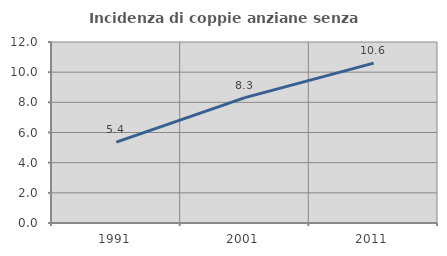
| Category | Incidenza di coppie anziane senza figli  |
|---|---|
| 1991.0 | 5.362 |
| 2001.0 | 8.31 |
| 2011.0 | 10.6 |